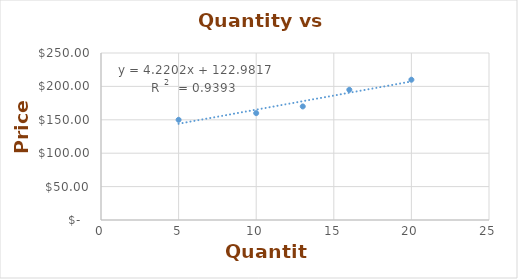
| Category | Price |
|---|---|
| 5.0 | 150 |
| 10.0 | 160 |
| 13.0 | 170 |
| 16.0 | 195 |
| 20.0 | 210 |